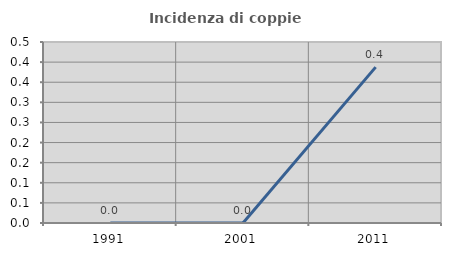
| Category | Incidenza di coppie miste |
|---|---|
| 1991.0 | 0 |
| 2001.0 | 0 |
| 2011.0 | 0.388 |